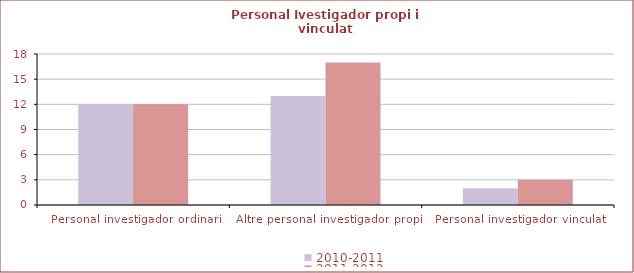
| Category | 2010-2011 | 2011-2012 |
|---|---|---|
| Personal investigador ordinari | 12 | 12 |
| Altre personal investigador propi | 13 | 17 |
| Personal investigador vinculat | 2 | 3 |